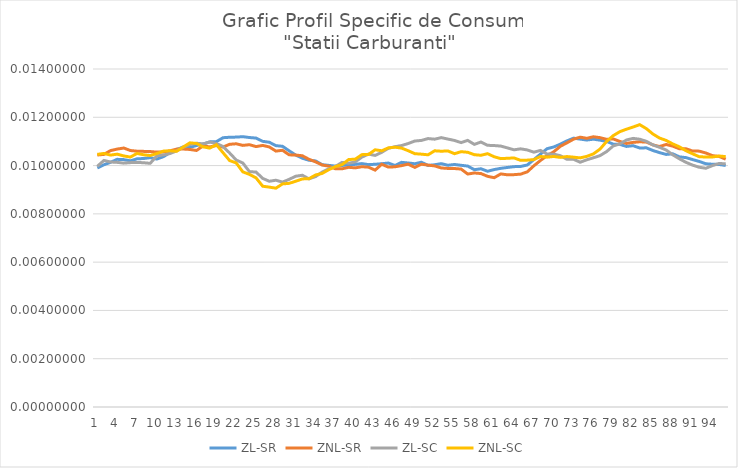
| Category | ZL-SR | ZNL-SR | ZL-SC | ZNL-SC |
|---|---|---|---|---|
| 0 | 0.01 | 0.01 | 0.01 | 0.01 |
| 1 | 0.01 | 0.01 | 0.01 | 0.011 |
| 2 | 0.01 | 0.011 | 0.01 | 0.01 |
| 3 | 0.01 | 0.011 | 0.01 | 0.01 |
| 4 | 0.01 | 0.011 | 0.01 | 0.01 |
| 5 | 0.01 | 0.011 | 0.01 | 0.01 |
| 6 | 0.01 | 0.011 | 0.01 | 0.011 |
| 7 | 0.01 | 0.011 | 0.01 | 0.01 |
| 8 | 0.01 | 0.011 | 0.01 | 0.01 |
| 9 | 0.01 | 0.011 | 0.01 | 0.01 |
| 10 | 0.01 | 0.011 | 0.01 | 0.011 |
| 11 | 0.011 | 0.011 | 0.01 | 0.011 |
| 12 | 0.011 | 0.011 | 0.011 | 0.011 |
| 13 | 0.011 | 0.011 | 0.011 | 0.011 |
| 14 | 0.011 | 0.011 | 0.011 | 0.011 |
| 15 | 0.011 | 0.011 | 0.011 | 0.011 |
| 16 | 0.011 | 0.011 | 0.011 | 0.011 |
| 17 | 0.011 | 0.011 | 0.011 | 0.011 |
| 18 | 0.011 | 0.011 | 0.011 | 0.011 |
| 19 | 0.011 | 0.011 | 0.011 | 0.011 |
| 20 | 0.011 | 0.011 | 0.011 | 0.01 |
| 21 | 0.011 | 0.011 | 0.01 | 0.01 |
| 22 | 0.011 | 0.011 | 0.01 | 0.01 |
| 23 | 0.011 | 0.011 | 0.01 | 0.01 |
| 24 | 0.011 | 0.011 | 0.01 | 0.009 |
| 25 | 0.011 | 0.011 | 0.009 | 0.009 |
| 26 | 0.011 | 0.011 | 0.009 | 0.009 |
| 27 | 0.011 | 0.011 | 0.009 | 0.009 |
| 28 | 0.011 | 0.011 | 0.009 | 0.009 |
| 29 | 0.011 | 0.01 | 0.009 | 0.009 |
| 30 | 0.01 | 0.01 | 0.01 | 0.009 |
| 31 | 0.01 | 0.01 | 0.01 | 0.009 |
| 32 | 0.01 | 0.01 | 0.009 | 0.009 |
| 33 | 0.01 | 0.01 | 0.01 | 0.01 |
| 34 | 0.01 | 0.01 | 0.01 | 0.01 |
| 35 | 0.01 | 0.01 | 0.01 | 0.01 |
| 36 | 0.01 | 0.01 | 0.01 | 0.01 |
| 37 | 0.01 | 0.01 | 0.01 | 0.01 |
| 38 | 0.01 | 0.01 | 0.01 | 0.01 |
| 39 | 0.01 | 0.01 | 0.01 | 0.01 |
| 40 | 0.01 | 0.01 | 0.01 | 0.01 |
| 41 | 0.01 | 0.01 | 0.01 | 0.01 |
| 42 | 0.01 | 0.01 | 0.01 | 0.011 |
| 43 | 0.01 | 0.01 | 0.011 | 0.011 |
| 44 | 0.01 | 0.01 | 0.011 | 0.011 |
| 45 | 0.01 | 0.01 | 0.011 | 0.011 |
| 46 | 0.01 | 0.01 | 0.011 | 0.011 |
| 47 | 0.01 | 0.01 | 0.011 | 0.011 |
| 48 | 0.01 | 0.01 | 0.011 | 0.01 |
| 49 | 0.01 | 0.01 | 0.011 | 0.01 |
| 50 | 0.01 | 0.01 | 0.011 | 0.01 |
| 51 | 0.01 | 0.01 | 0.011 | 0.011 |
| 52 | 0.01 | 0.01 | 0.011 | 0.011 |
| 53 | 0.01 | 0.01 | 0.011 | 0.011 |
| 54 | 0.01 | 0.01 | 0.011 | 0.01 |
| 55 | 0.01 | 0.01 | 0.011 | 0.011 |
| 56 | 0.01 | 0.01 | 0.011 | 0.011 |
| 57 | 0.01 | 0.01 | 0.011 | 0.01 |
| 58 | 0.01 | 0.01 | 0.011 | 0.01 |
| 59 | 0.01 | 0.01 | 0.011 | 0.01 |
| 60 | 0.01 | 0.009 | 0.011 | 0.01 |
| 61 | 0.01 | 0.01 | 0.011 | 0.01 |
| 62 | 0.01 | 0.01 | 0.011 | 0.01 |
| 63 | 0.01 | 0.01 | 0.011 | 0.01 |
| 64 | 0.01 | 0.01 | 0.011 | 0.01 |
| 65 | 0.01 | 0.01 | 0.011 | 0.01 |
| 66 | 0.01 | 0.01 | 0.011 | 0.01 |
| 67 | 0.01 | 0.01 | 0.011 | 0.01 |
| 68 | 0.011 | 0.01 | 0.01 | 0.01 |
| 69 | 0.011 | 0.011 | 0.01 | 0.01 |
| 70 | 0.011 | 0.011 | 0.01 | 0.01 |
| 71 | 0.011 | 0.011 | 0.01 | 0.01 |
| 72 | 0.011 | 0.011 | 0.01 | 0.01 |
| 73 | 0.011 | 0.011 | 0.01 | 0.01 |
| 74 | 0.011 | 0.011 | 0.01 | 0.01 |
| 75 | 0.011 | 0.011 | 0.01 | 0.01 |
| 76 | 0.011 | 0.011 | 0.01 | 0.011 |
| 77 | 0.011 | 0.011 | 0.011 | 0.011 |
| 78 | 0.011 | 0.011 | 0.011 | 0.011 |
| 79 | 0.011 | 0.011 | 0.011 | 0.011 |
| 80 | 0.011 | 0.011 | 0.011 | 0.012 |
| 81 | 0.011 | 0.011 | 0.011 | 0.012 |
| 82 | 0.011 | 0.011 | 0.011 | 0.012 |
| 83 | 0.011 | 0.011 | 0.011 | 0.012 |
| 84 | 0.011 | 0.011 | 0.011 | 0.011 |
| 85 | 0.011 | 0.011 | 0.011 | 0.011 |
| 86 | 0.01 | 0.011 | 0.011 | 0.011 |
| 87 | 0.01 | 0.011 | 0.01 | 0.011 |
| 88 | 0.01 | 0.011 | 0.01 | 0.011 |
| 89 | 0.01 | 0.011 | 0.01 | 0.011 |
| 90 | 0.01 | 0.011 | 0.01 | 0.01 |
| 91 | 0.01 | 0.011 | 0.01 | 0.01 |
| 92 | 0.01 | 0.011 | 0.01 | 0.01 |
| 93 | 0.01 | 0.01 | 0.01 | 0.01 |
| 94 | 0.01 | 0.01 | 0.01 | 0.01 |
| 95 | 0.01 | 0.01 | 0.01 | 0.01 |